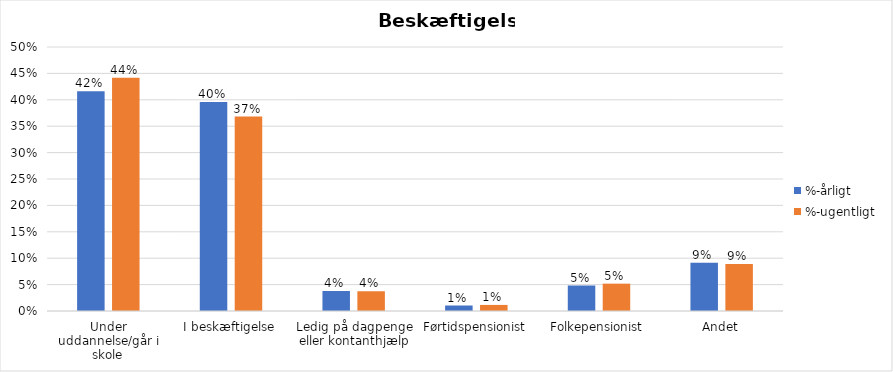
| Category | %-årligt | %-ugentligt |
|---|---|---|
| Under uddannelse/går i skole | 0.416 | 0.442 |
| I beskæftigelse | 0.396 | 0.368 |
| Ledig på dagpenge eller kontanthjælp | 0.038 | 0.037 |
| Førtidspensionist | 0.01 | 0.012 |
| Folkepensionist | 0.048 | 0.052 |
| Andet | 0.091 | 0.089 |